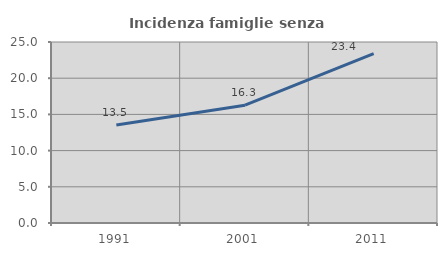
| Category | Incidenza famiglie senza nuclei |
|---|---|
| 1991.0 | 13.539 |
| 2001.0 | 16.269 |
| 2011.0 | 23.385 |